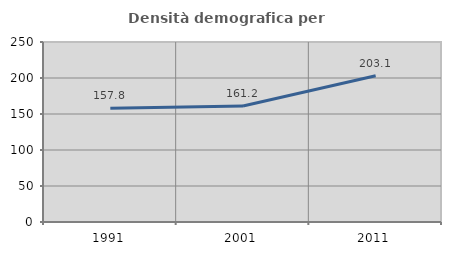
| Category | Densità demografica |
|---|---|
| 1991.0 | 157.845 |
| 2001.0 | 161.174 |
| 2011.0 | 203.063 |